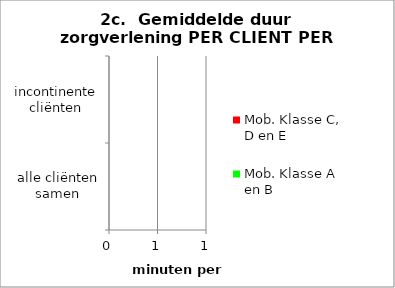
| Category | Mob. Klasse A en B | Mob. Klasse C, D en E |
|---|---|---|
| alle cliënten samen | 0 | 0 |
| incontinente cliënten | 0 | 0 |